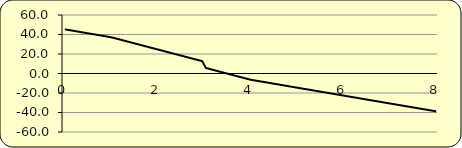
| Category | shear |
|---|---|
| 0.0 | 45.281 |
| 0.08 | 44.632 |
| 0.16 | 43.983 |
| 0.24 | 43.334 |
| 0.32 | 42.685 |
| 0.4 | 42.035 |
| 0.48000000000000004 | 41.386 |
| 0.56 | 40.737 |
| 0.64 | 40.088 |
| 0.72 | 39.439 |
| 0.7999999999999999 | 38.79 |
| 0.8799999999999999 | 38.141 |
| 0.9599999999999999 | 37.492 |
| 1.0399999999999998 | 36.666 |
| 1.1199999999999999 | 35.665 |
| 1.2 | 34.664 |
| 1.28 | 33.663 |
| 1.36 | 32.662 |
| 1.4400000000000002 | 31.661 |
| 1.5200000000000002 | 30.66 |
| 1.6000000000000003 | 29.659 |
| 1.6800000000000004 | 28.657 |
| 1.7600000000000005 | 27.656 |
| 1.8400000000000005 | 26.655 |
| 1.9200000000000006 | 25.654 |
| 2.0000000000000004 | 24.653 |
| 2.0800000000000005 | 23.652 |
| 2.1600000000000006 | 22.651 |
| 2.2400000000000007 | 21.65 |
| 2.3200000000000007 | 20.649 |
| 2.400000000000001 | 19.647 |
| 2.480000000000001 | 18.646 |
| 2.560000000000001 | 17.645 |
| 2.640000000000001 | 16.644 |
| 2.720000000000001 | 15.643 |
| 2.800000000000001 | 14.642 |
| 2.8800000000000012 | 13.641 |
| 2.9600000000000013 | 12.64 |
| 3.0400000000000014 | 5.638 |
| 3.1200000000000014 | 4.637 |
| 3.2000000000000015 | 3.636 |
| 3.2800000000000016 | 2.635 |
| 3.3600000000000017 | 1.634 |
| 3.4400000000000017 | 0.633 |
| 3.520000000000002 | -0.368 |
| 3.600000000000002 | -1.369 |
| 3.680000000000002 | -2.371 |
| 3.760000000000002 | -3.372 |
| 3.840000000000002 | -4.373 |
| 3.920000000000002 | -5.374 |
| 4.000000000000002 | -6.375 |
| 4.080000000000002 | -7.024 |
| 4.160000000000002 | -7.673 |
| 4.240000000000002 | -8.322 |
| 4.320000000000002 | -8.971 |
| 4.400000000000002 | -9.621 |
| 4.480000000000002 | -10.27 |
| 4.560000000000002 | -10.919 |
| 4.640000000000002 | -11.568 |
| 4.720000000000002 | -12.217 |
| 4.8000000000000025 | -12.866 |
| 4.880000000000003 | -13.515 |
| 4.960000000000003 | -14.164 |
| 5.040000000000003 | -14.814 |
| 5.120000000000003 | -15.463 |
| 5.200000000000003 | -16.112 |
| 5.280000000000003 | -16.761 |
| 5.360000000000003 | -17.41 |
| 5.440000000000003 | -18.059 |
| 5.520000000000003 | -18.708 |
| 5.600000000000003 | -19.357 |
| 5.680000000000003 | -20.007 |
| 5.760000000000003 | -20.656 |
| 5.840000000000003 | -21.305 |
| 5.9200000000000035 | -21.954 |
| 6.0000000000000036 | -22.603 |
| 6.080000000000004 | -23.252 |
| 6.160000000000004 | -23.901 |
| 6.240000000000004 | -24.55 |
| 6.320000000000004 | -25.199 |
| 6.400000000000004 | -25.849 |
| 6.480000000000004 | -26.498 |
| 6.560000000000004 | -27.147 |
| 6.640000000000004 | -27.796 |
| 6.720000000000004 | -28.445 |
| 6.800000000000004 | -29.094 |
| 6.880000000000004 | -29.743 |
| 6.960000000000004 | -30.392 |
| 7.0400000000000045 | -31.042 |
| 7.1200000000000045 | -31.691 |
| 7.200000000000005 | -32.34 |
| 7.280000000000005 | -32.989 |
| 7.360000000000005 | -33.638 |
| 7.440000000000005 | -34.287 |
| 7.520000000000005 | -34.936 |
| 7.600000000000005 | -35.585 |
| 7.680000000000005 | -36.235 |
| 7.760000000000005 | -36.884 |
| 7.840000000000005 | -37.533 |
| 7.920000000000005 | -38.182 |
| 8.000000000000005 | -38.831 |